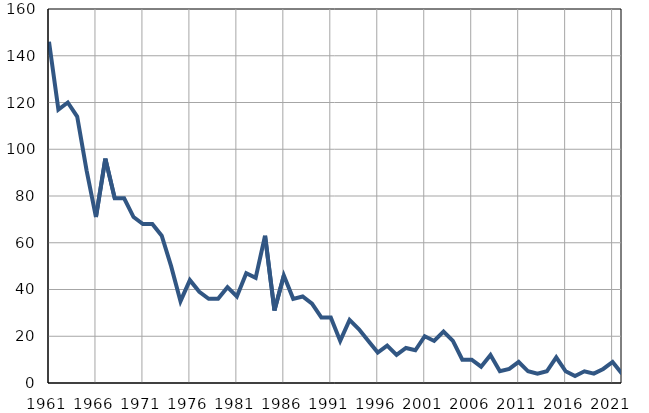
| Category | Умрла 
одојчад |
|---|---|
| 1961.0 | 146 |
| 1962.0 | 117 |
| 1963.0 | 120 |
| 1964.0 | 114 |
| 1965.0 | 91 |
| 1966.0 | 71 |
| 1967.0 | 96 |
| 1968.0 | 79 |
| 1969.0 | 79 |
| 1970.0 | 71 |
| 1971.0 | 68 |
| 1972.0 | 68 |
| 1973.0 | 63 |
| 1974.0 | 50 |
| 1975.0 | 35 |
| 1976.0 | 44 |
| 1977.0 | 39 |
| 1978.0 | 36 |
| 1979.0 | 36 |
| 1980.0 | 41 |
| 1981.0 | 37 |
| 1982.0 | 47 |
| 1983.0 | 45 |
| 1984.0 | 63 |
| 1985.0 | 31 |
| 1986.0 | 46 |
| 1987.0 | 36 |
| 1988.0 | 37 |
| 1989.0 | 34 |
| 1990.0 | 28 |
| 1991.0 | 28 |
| 1992.0 | 18 |
| 1993.0 | 27 |
| 1994.0 | 23 |
| 1995.0 | 18 |
| 1996.0 | 13 |
| 1997.0 | 16 |
| 1998.0 | 12 |
| 1999.0 | 15 |
| 2000.0 | 14 |
| 2001.0 | 20 |
| 2002.0 | 18 |
| 2003.0 | 22 |
| 2004.0 | 18 |
| 2005.0 | 10 |
| 2006.0 | 10 |
| 2007.0 | 7 |
| 2008.0 | 12 |
| 2009.0 | 5 |
| 2010.0 | 6 |
| 2011.0 | 9 |
| 2012.0 | 5 |
| 2013.0 | 4 |
| 2014.0 | 5 |
| 2015.0 | 11 |
| 2016.0 | 5 |
| 2017.0 | 3 |
| 2018.0 | 5 |
| 2019.0 | 4 |
| 2020.0 | 6 |
| 2021.0 | 9 |
| 2022.0 | 4 |